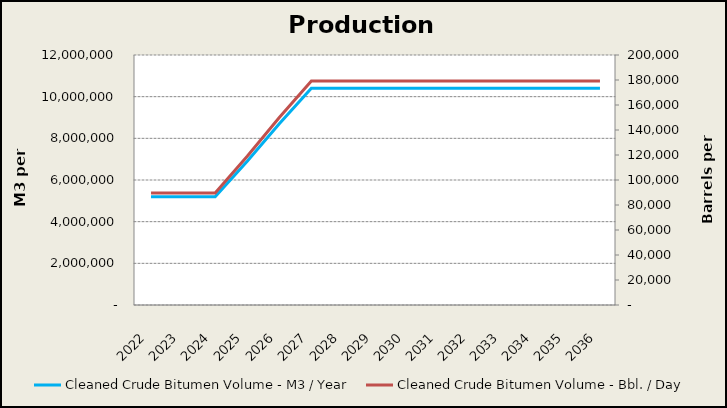
| Category | Cleaned Crude Bitumen Volume - M3 / Year |
|---|---|
| 2022.0 | 5200000 |
| 2023.0 | 5200000 |
| 2024.0 | 5200000 |
| 2025.0 | 6900000 |
| 2026.0 | 8700000 |
| 2027.0 | 10400000 |
| 2028.0 | 10400000 |
| 2029.0 | 10400000 |
| 2030.0 | 10400000 |
| 2031.0 | 10400000 |
| 2032.0 | 10400000 |
| 2033.0 | 10400000 |
| 2034.0 | 10400000 |
| 2035.0 | 10400000 |
| 2036.0 | 10400000 |